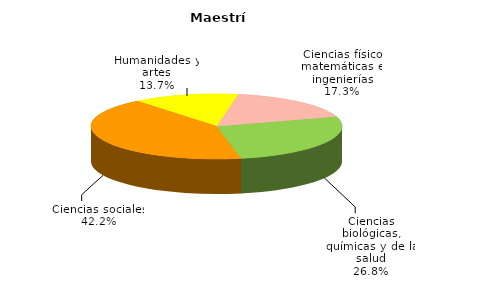
| Category | Series 0 |
|---|---|
| Ciencias físico matemáticas e ingenierías | 1786 |
| Ciencias biológicas, químicas y de la salud | 2755 |
| Ciencias sociales | 4349 |
| Humanidades y artes | 1407 |